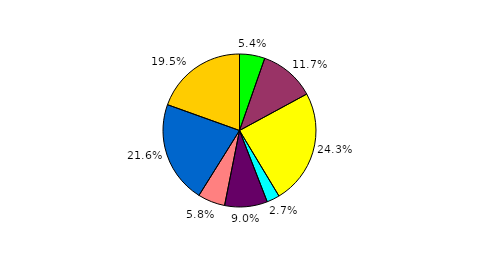
| Category | Series 0 |
|---|---|
| 0 | 5.356 |
| 1 | 11.737 |
| 2 | 24.278 |
| 3 | 2.724 |
| 4 | 9.031 |
| 5 | 5.759 |
| 6 | 21.59 |
| 7 | 19.525 |